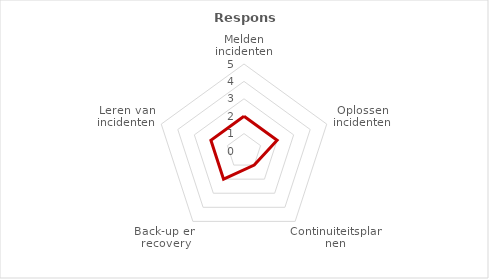
| Category | Series 0 |
|---|---|
| Melden incidenten | 2 |
| Oplossen incidenten | 2 |
| Continuiteitsplannen | 1 |
| Back-up en recovery | 2 |
| Leren van incidenten | 2 |